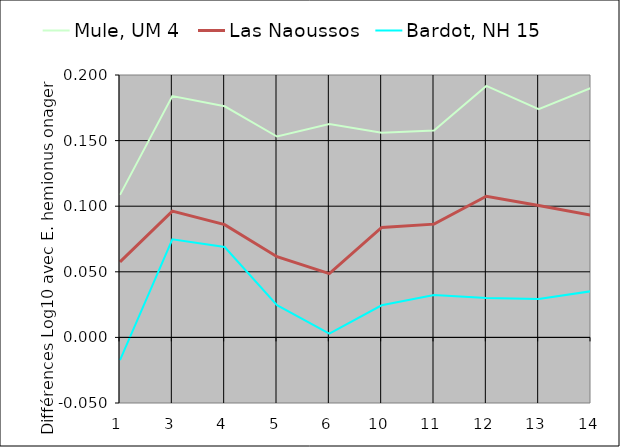
| Category | Mule, UM 4 | Las Naoussos | Bardot, NH 15 |
|---|---|---|---|
| 1.0 | 0.109 | 0.057 | -0.017 |
| 3.0 | 0.184 | 0.096 | 0.075 |
| 4.0 | 0.176 | 0.086 | 0.069 |
| 5.0 | 0.153 | 0.062 | 0.025 |
| 6.0 | 0.163 | 0.049 | 0.003 |
| 10.0 | 0.156 | 0.084 | 0.024 |
| 11.0 | 0.158 | 0.086 | 0.032 |
| 12.0 | 0.192 | 0.108 | 0.03 |
| 13.0 | 0.174 | 0.101 | 0.029 |
| 14.0 | 0.19 | 0.093 | 0.035 |